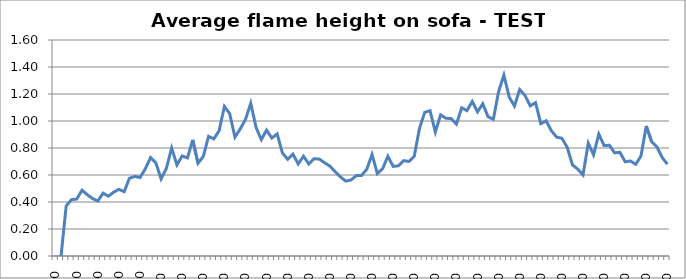
| Category | m |
|---|---|
| 0.0 | -0.01 |
| 5.0 | -0.01 |
| 10.0 | 0.37 |
| 15.0 | 0.417 |
| 20.0 | 0.422 |
| 25.0 | 0.487 |
| 30.0 | 0.454 |
| 35.0 | 0.426 |
| 40.0 | 0.408 |
| 45.0 | 0.466 |
| 50.0 | 0.443 |
| 55.0 | 0.473 |
| 60.0 | 0.494 |
| 65.0 | 0.476 |
| 70.0 | 0.576 |
| 75.0 | 0.589 |
| 80.0 | 0.581 |
| 85.0 | 0.645 |
| 90.0 | 0.729 |
| 95.0 | 0.69 |
| 100.0 | 0.571 |
| 105.0 | 0.649 |
| 110.0 | 0.8 |
| 115.0 | 0.675 |
| 120.0 | 0.741 |
| 125.0 | 0.726 |
| 130.0 | 0.86 |
| 135.0 | 0.687 |
| 140.0 | 0.737 |
| 145.0 | 0.886 |
| 150.0 | 0.868 |
| 155.0 | 0.928 |
| 160.0 | 1.108 |
| 165.0 | 1.055 |
| 170.0 | 0.881 |
| 175.0 | 0.941 |
| 180.0 | 1.012 |
| 185.0 | 1.131 |
| 190.0 | 0.954 |
| 195.0 | 0.862 |
| 200.0 | 0.932 |
| 205.0 | 0.873 |
| 210.0 | 0.904 |
| 215.0 | 0.764 |
| 220.0 | 0.716 |
| 225.0 | 0.754 |
| 230.0 | 0.682 |
| 235.0 | 0.739 |
| 240.0 | 0.682 |
| 245.0 | 0.72 |
| 250.0 | 0.718 |
| 255.0 | 0.691 |
| 260.0 | 0.666 |
| 265.0 | 0.624 |
| 270.0 | 0.586 |
| 275.0 | 0.555 |
| 280.0 | 0.563 |
| 285.0 | 0.595 |
| 290.0 | 0.597 |
| 295.0 | 0.643 |
| 300.0 | 0.752 |
| 305.0 | 0.611 |
| 310.0 | 0.647 |
| 315.0 | 0.739 |
| 320.0 | 0.664 |
| 325.0 | 0.668 |
| 330.0 | 0.706 |
| 335.0 | 0.7 |
| 340.0 | 0.739 |
| 345.0 | 0.946 |
| 350.0 | 1.064 |
| 355.0 | 1.076 |
| 360.0 | 0.918 |
| 365.0 | 1.046 |
| 370.0 | 1.02 |
| 375.0 | 1.019 |
| 380.0 | 0.977 |
| 385.0 | 1.098 |
| 390.0 | 1.077 |
| 395.0 | 1.145 |
| 400.0 | 1.068 |
| 405.0 | 1.128 |
| 410.0 | 1.032 |
| 415.0 | 1.013 |
| 420.0 | 1.219 |
| 425.0 | 1.34 |
| 430.0 | 1.178 |
| 435.0 | 1.111 |
| 440.0 | 1.233 |
| 445.0 | 1.189 |
| 450.0 | 1.112 |
| 455.0 | 1.136 |
| 460.0 | 0.98 |
| 465.0 | 1.001 |
| 470.0 | 0.928 |
| 475.0 | 0.88 |
| 480.0 | 0.872 |
| 485.0 | 0.806 |
| 490.0 | 0.675 |
| 495.0 | 0.644 |
| 500.0 | 0.601 |
| 505.0 | 0.835 |
| 510.0 | 0.75 |
| 515.0 | 0.903 |
| 520.0 | 0.818 |
| 525.0 | 0.82 |
| 530.0 | 0.764 |
| 535.0 | 0.768 |
| 540.0 | 0.698 |
| 545.0 | 0.704 |
| 550.0 | 0.679 |
| 555.0 | 0.741 |
| 560.0 | 0.963 |
| 565.0 | 0.848 |
| 570.0 | 0.809 |
| 575.0 | 0.73 |
| 580.0 | 0.68 |